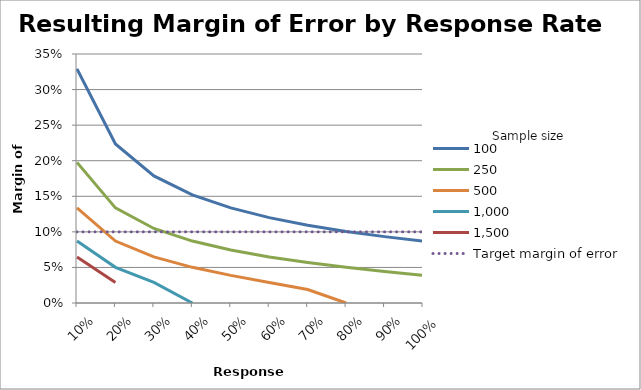
| Category |  100  |  250  |  500  |  1,000  |  1,500  | Target margin of error |
|---|---|---|---|---|---|---|
| 0.1 | 0.329 | 0.198 | 0.134 | 0.087 | 0.065 | 0.1 |
| 0.2 | 0.224 | 0.134 | 0.087 | 0.05 | 0.029 | 0.1 |
| 0.3 | 0.179 | 0.105 | 0.065 | 0.029 | 0 | 0.1 |
| 0.4 | 0.152 | 0.087 | 0.05 | 0 | 0 | 0.1 |
| 0.5 | 0.134 | 0.074 | 0.039 | 0 | 0 | 0.1 |
| 0.6 | 0.12 | 0.065 | 0.029 | 0 | 0 | 0.1 |
| 0.7 | 0.109 | 0.057 | 0.019 | 0 | 0 | 0.1 |
| 0.8 | 0.101 | 0.05 | 0 | 0 | 0 | 0.1 |
| 0.9 | 0.093 | 0.044 | 0 | 0 | 0 | 0.1 |
| 1.0 | 0.087 | 0.039 | 0 | 0 | 0 | 0.1 |